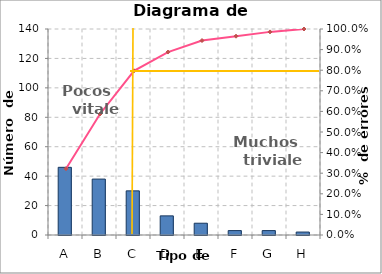
| Category | Nº de errores |
|---|---|
| A | 46 |
| B | 38 |
| C | 30 |
| D | 13 |
| E | 8 |
| F | 3 |
| G | 3 |
| H | 2 |